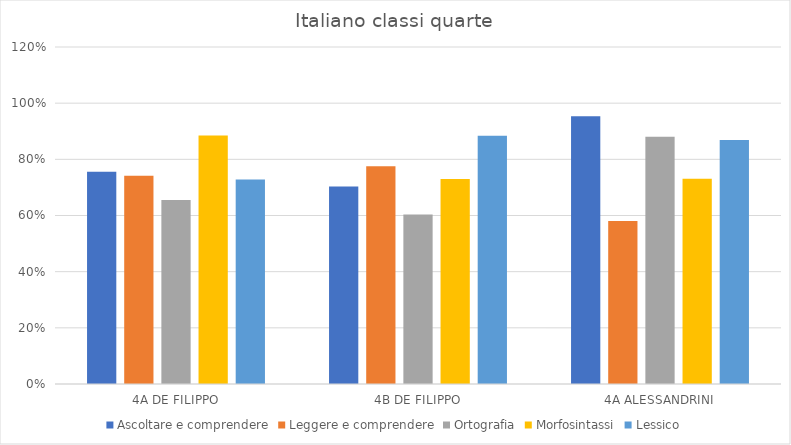
| Category | Ascoltare e comprendere | Leggere e comprendere | Ortografia | Morfosintassi | Lessico |
|---|---|---|---|---|---|
| 4A DE FILIPPO | 0.756 | 0.742 | 0.656 | 0.885 | 0.728 |
| 4B DE FILIPPO | 0.703 | 0.775 | 0.603 | 0.73 | 0.884 |
| 4A ALESSANDRINI | 0.954 | 0.581 | 0.881 | 0.731 | 0.869 |